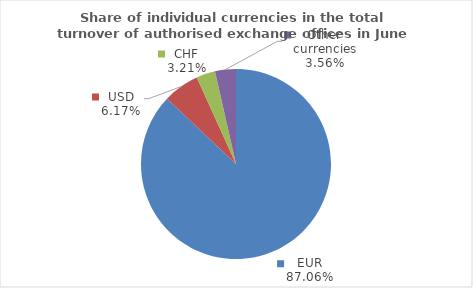
| Category | Series 0 |
|---|---|
| EUR | 87.059 |
| USD | 6.174 |
| CHF | 3.21 |
| Other currencies | 3.557 |